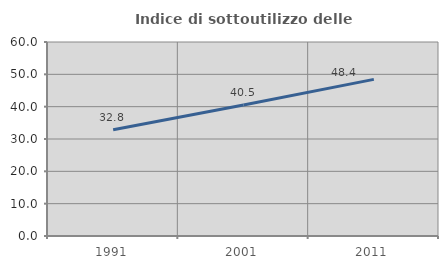
| Category | Indice di sottoutilizzo delle abitazioni  |
|---|---|
| 1991.0 | 32.836 |
| 2001.0 | 40.502 |
| 2011.0 | 48.441 |